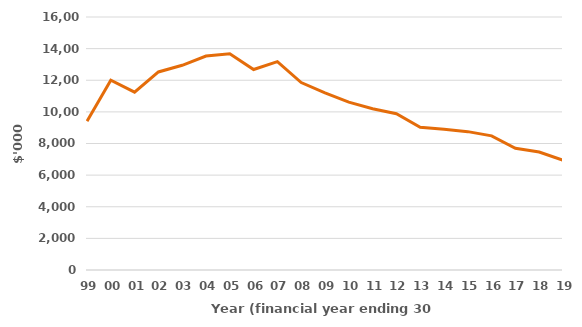
| Category | Total tax ($'000)a, b |
|---|---|
| 99 | 9410.466 |
| 00 | 12005.07 |
| 01 | 11245.54 |
| 02 | 12524.903 |
| 03 | 12946.255 |
| 04 | 13530.355 |
| 05 | 13676.583 |
| 06 | 12676.904 |
| 07 | 13175.868 |
| 08 | 11856.63 |
| 09 | 11204.577 |
| 10 | 10612.985 |
| 11 | 10201.646 |
| 12 | 9879.621 |
| 13 | 9023.033 |
| 14 | 8900.379 |
| 15 | 8750.216 |
| 16 | 8485.109 |
| 17 | 7699.19 |
| 18 | 7458.579 |
| 19 | 6938.912 |